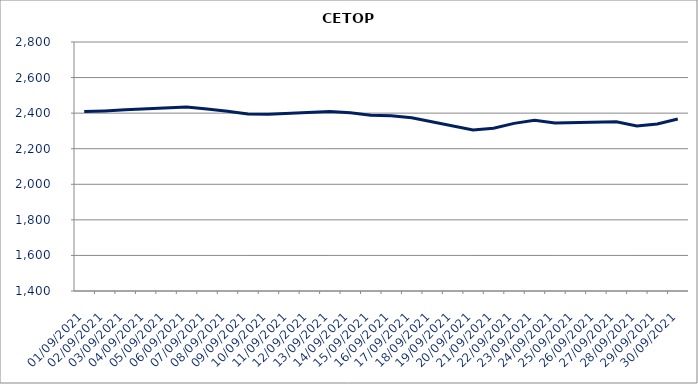
| Category | CETOP |
|---|---|
| 01/09/2021 | 2408.72 |
| 02/09/2021 | 2412.64 |
| 03/09/2021 | 2418.55 |
| 06/09/2021 | 2434.27 |
| 07/09/2021 | 2423.33 |
| 08/09/2021 | 2410.33 |
| 09/09/2021 | 2395.53 |
| 10/09/2021 | 2393.5 |
| 13/09/2021 | 2409.5 |
| 14/09/2021 | 2401.55 |
| 15/09/2021 | 2387.77 |
| 16/09/2021 | 2385.41 |
| 17/09/2021 | 2374.54 |
| 20/09/2021 | 2305.89 |
| 21/09/2021 | 2315.21 |
| 22/09/2021 | 2342.42 |
| 23/09/2021 | 2359.97 |
| 24/09/2021 | 2344.48 |
| 27/09/2021 | 2351.98 |
| 28/09/2021 | 2327.67 |
| 29/09/2021 | 2338.97 |
| 30/09/2021 | 2366.72 |